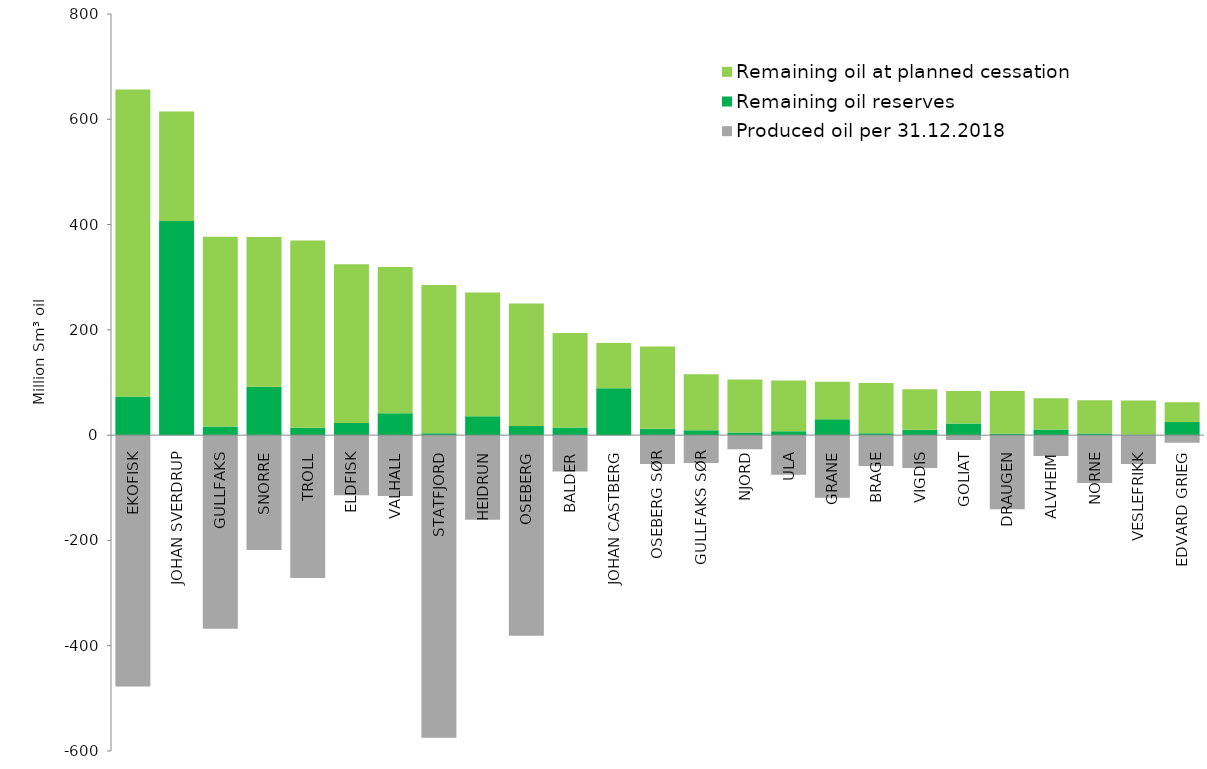
| Category | Produced oil per 31.12.2018 | Remaining oil reserves | Remaining oil at planned cessation |
|---|---|---|---|
| EKOFISK | -477.7 | 73.42 | 583.08 |
| JOHAN SVERDRUP | 0 | 406.58 | 208.42 |
| GULLFAKS | -367.74 | 16.25 | 360.61 |
| SNORRE | -218.27 | 91.78 | 284.63 |
| TROLL | -271.59 | 14.11 | 355.8 |
| ELDFISK | -114.41 | 23.04 | 301.36 |
| VALHALL | -115.73 | 41.37 | 278.11 |
| STATFJORD | -574.78 | 3.65 | 281.39 |
| HEIDRUN | -160.81 | 35.74 | 235.45 |
| OSEBERG | -381.09 | 17.52 | 232.69 |
| BALDER | -69.09 | 14.64 | 179.47 |
| JOHAN CASTBERG | 0 | 88.9 | 86.34 |
| OSEBERG SØR | -54.71 | 12 | 156.29 |
| GULLFAKS SØR | -52.84 | 9.41 | 106.03 |
| NJORD | -26.65 | 4.85 | 100.69 |
| ULA | -75.4 | 7.51 | 96.43 |
| GRANE | -118.81 | 29.98 | 71.21 |
| BRAGE | -58.83 | 3.59 | 95.38 |
| VIGDIS | -62.61 | 10.25 | 76.94 |
| GOLIAT | -9.21 | 22.24 | 61.65 |
| DRAUGEN | -140.62 | 2.62 | 81.16 |
| ALVHEIM | -39.6 | 10.74 | 59.16 |
| NORNE | -90.78 | 3.04 | 63.18 |
| VESLEFRIKK | -54.79 | 1.36 | 64.41 |
| EDVARD GRIEG | -14.32 | 25.15 | 37.53 |